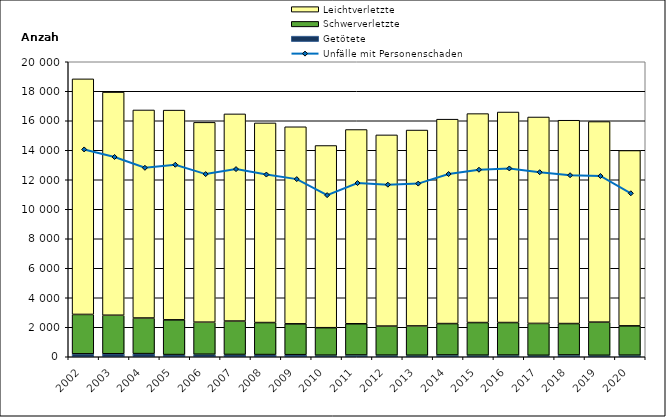
| Category | Getötete | Schwerverletzte | Leichtverletzte |
|---|---|---|---|
| 2002.0 | 199 | 2670 | 15971 |
| 2003.0 | 204 | 2611 | 15128 |
| 2004.0 | 212 | 2415 | 14104 |
| 2005.0 | 148 | 2355 | 14219 |
| 2006.0 | 172 | 2173 | 13546 |
| 2007.0 | 156 | 2265 | 14043 |
| 2008.0 | 149 | 2169 | 13535 |
| 2009.0 | 140 | 2092 | 13360 |
| 2010.0 | 108 | 1862 | 12352 |
| 2011.0 | 120 | 2116 | 13169 |
| 2012.0 | 110 | 1970 | 12961 |
| 2013.0 | 103 | 1987 | 13280 |
| 2014.0 | 121 | 2128 | 13858 |
| 2015.0 | 107 | 2211 | 14167 |
| 2016.0 | 114 | 2205 | 14274 |
| 2017.0 | 100 | 2160 | 13995 |
| 2018.0 | 122 | 2129 | 13785 |
| 2019.0 | 100 | 2248 | 13597 |
| 2020.0 | 107 | 1988 | 11888 |